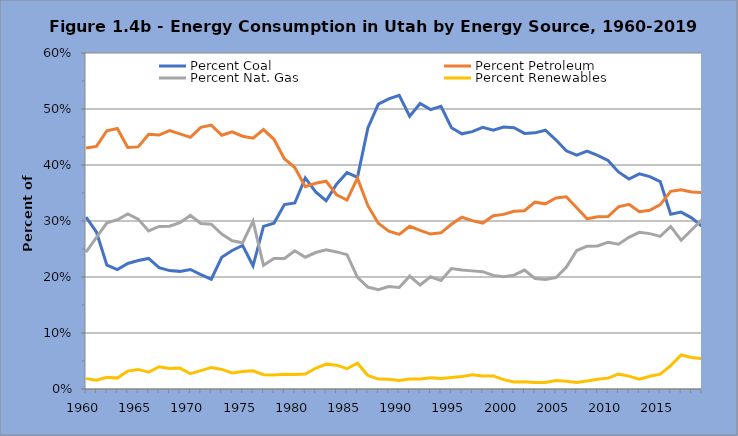
| Category | Percent Coal | Percent Petroleum | Percent Nat. Gas | Percent Renewables |
|---|---|---|---|---|
| 1960.0 | 0.307 | 0.43 | 0.244 | 0.019 |
| 1961.0 | 0.28 | 0.433 | 0.271 | 0.016 |
| 1962.0 | 0.221 | 0.461 | 0.297 | 0.021 |
| 1963.0 | 0.213 | 0.465 | 0.302 | 0.019 |
| 1964.0 | 0.224 | 0.431 | 0.313 | 0.032 |
| 1965.0 | 0.229 | 0.432 | 0.303 | 0.035 |
| 1966.0 | 0.233 | 0.455 | 0.282 | 0.03 |
| 1967.0 | 0.217 | 0.453 | 0.29 | 0.04 |
| 1968.0 | 0.211 | 0.461 | 0.291 | 0.037 |
| 1969.0 | 0.21 | 0.456 | 0.297 | 0.037 |
| 1970.0 | 0.213 | 0.449 | 0.31 | 0.027 |
| 1971.0 | 0.204 | 0.467 | 0.296 | 0.033 |
| 1972.0 | 0.196 | 0.471 | 0.294 | 0.039 |
| 1973.0 | 0.235 | 0.453 | 0.277 | 0.035 |
| 1974.0 | 0.247 | 0.459 | 0.265 | 0.029 |
| 1975.0 | 0.256 | 0.451 | 0.261 | 0.031 |
| 1976.0 | 0.22 | 0.448 | 0.3 | 0.032 |
| 1977.0 | 0.29 | 0.463 | 0.221 | 0.026 |
| 1978.0 | 0.296 | 0.446 | 0.233 | 0.025 |
| 1979.0 | 0.329 | 0.411 | 0.233 | 0.026 |
| 1980.0 | 0.332 | 0.395 | 0.247 | 0.026 |
| 1981.0 | 0.377 | 0.361 | 0.235 | 0.027 |
| 1982.0 | 0.352 | 0.367 | 0.244 | 0.037 |
| 1983.0 | 0.336 | 0.371 | 0.249 | 0.044 |
| 1984.0 | 0.366 | 0.347 | 0.245 | 0.043 |
| 1985.0 | 0.386 | 0.337 | 0.24 | 0.036 |
| 1986.0 | 0.378 | 0.376 | 0.199 | 0.046 |
| 1987.0 | 0.466 | 0.327 | 0.182 | 0.024 |
| 1988.0 | 0.509 | 0.296 | 0.177 | 0.018 |
| 1989.0 | 0.518 | 0.282 | 0.183 | 0.017 |
| 1990.0 | 0.524 | 0.276 | 0.181 | 0.015 |
| 1991.0 | 0.487 | 0.291 | 0.202 | 0.018 |
| 1992.0 | 0.51 | 0.283 | 0.186 | 0.018 |
| 1993.0 | 0.499 | 0.277 | 0.2 | 0.02 |
| 1994.0 | 0.505 | 0.279 | 0.194 | 0.019 |
| 1995.0 | 0.467 | 0.294 | 0.215 | 0.02 |
| 1996.0 | 0.456 | 0.307 | 0.212 | 0.022 |
| 1997.0 | 0.459 | 0.301 | 0.211 | 0.025 |
| 1998.0 | 0.467 | 0.296 | 0.209 | 0.023 |
| 1999.0 | 0.462 | 0.309 | 0.203 | 0.023 |
| 2000.0 | 0.468 | 0.312 | 0.201 | 0.017 |
| 2001.0 | 0.466 | 0.317 | 0.203 | 0.013 |
| 2002.0 | 0.456 | 0.318 | 0.212 | 0.013 |
| 2003.0 | 0.457 | 0.334 | 0.197 | 0.012 |
| 2004.0 | 0.462 | 0.331 | 0.196 | 0.012 |
| 2005.0 | 0.445 | 0.341 | 0.199 | 0.015 |
| 2006.0 | 0.425 | 0.343 | 0.218 | 0.014 |
| 2007.0 | 0.418 | 0.324 | 0.247 | 0.011 |
| 2008.0 | 0.425 | 0.304 | 0.255 | 0.014 |
| 2009.0 | 0.417 | 0.308 | 0.255 | 0.017 |
| 2010.0 | 0.408 | 0.308 | 0.262 | 0.019 |
| 2011.0 | 0.388 | 0.325 | 0.259 | 0.027 |
| 2012.0 | 0.375 | 0.33 | 0.271 | 0.023 |
| 2013.0 | 0.384 | 0.317 | 0.28 | 0.018 |
| 2014.0 | 0.379 | 0.319 | 0.277 | 0.023 |
| 2015.0 | 0.37 | 0.329 | 0.273 | 0.026 |
| 2016.0 | 0.312 | 0.353 | 0.29 | 0.042 |
| 2017.0 | 0.316 | 0.356 | 0.266 | 0.061 |
| 2018.0 | 0.306 | 0.352 | 0.284 | 0.056 |
| 2019.0 | 0.29 | 0.351 | 0.302 | 0.054 |